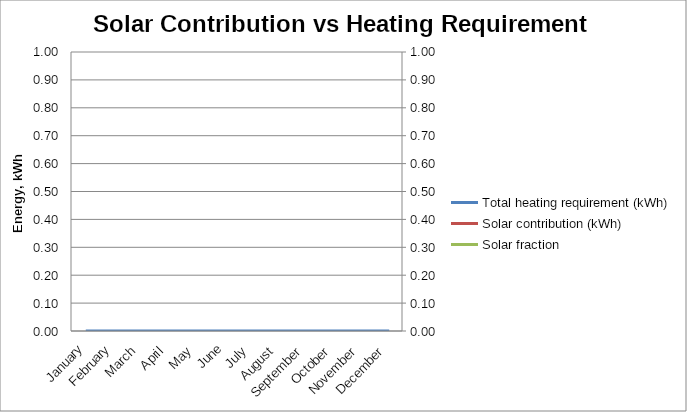
| Category | Total heating requirement (kWh) | Solar contribution (kWh) |
|---|---|---|
| January | 0 |  |
| February | 0 |  |
| March | 0 |  |
| April | 0 |  |
| May | 0 |  |
| June | 0 |  |
| July | 0 |  |
| August | 0 |  |
| September | 0 |  |
| October | 0 |  |
| November | 0 |  |
| December | 0 |  |